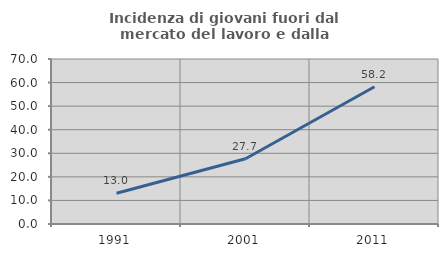
| Category | Incidenza di giovani fuori dal mercato del lavoro e dalla formazione  |
|---|---|
| 1991.0 | 13.033 |
| 2001.0 | 27.686 |
| 2011.0 | 58.209 |